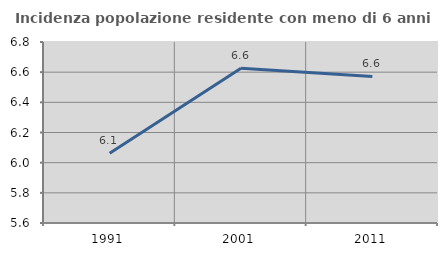
| Category | Incidenza popolazione residente con meno di 6 anni |
|---|---|
| 1991.0 | 6.063 |
| 2001.0 | 6.626 |
| 2011.0 | 6.572 |